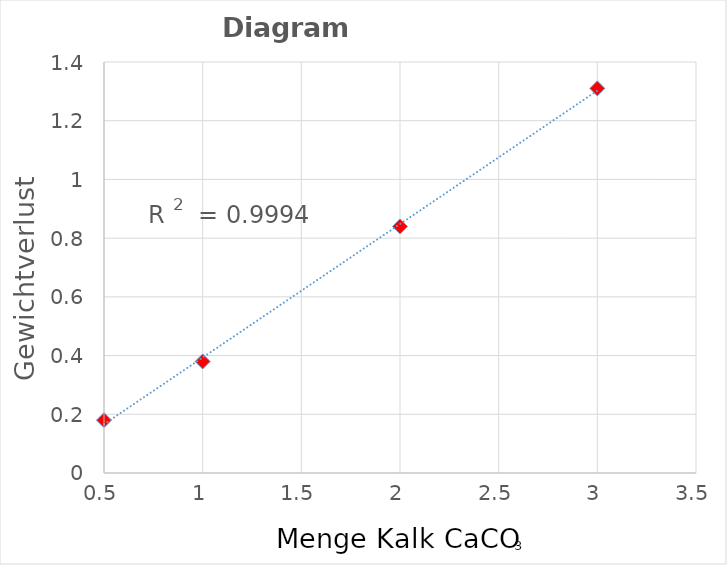
| Category | Gewichtsverlust in g |
|---|---|
| 0.5 | 0.18 |
| 1.0 | 0.38 |
| 2.0 | 0.84 |
| 3.0 | 1.31 |